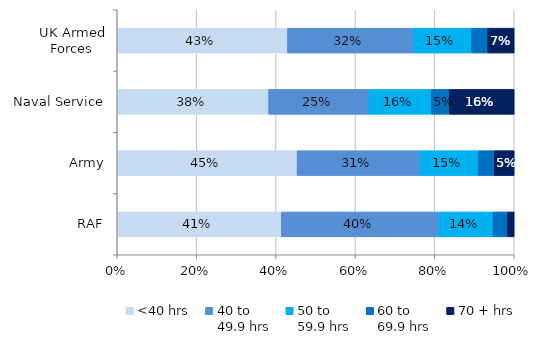
| Category | <40 hrs | 40 to 
49.9 hrs | 50 to 
59.9 hrs | 60 to 
69.9 hrs | 70 + hrs |
|---|---|---|---|---|---|
| UK Armed Forces | 0.429 | 0.317 | 0.147 | 0.04 | 0.067 |
| Naval Service | 0.382 | 0.252 | 0.157 | 0.046 | 0.163 |
| Army | 0.453 | 0.309 | 0.148 | 0.04 | 0.05 |
| RAF | 0.414 | 0.397 | 0.136 | 0.037 | 0.017 |